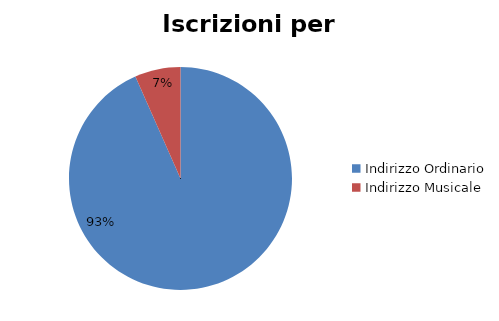
| Category | #REF! |
|---|---|
| Indirizzo Ordinario | 37202 |
| Indirizzo Musicale | 2642 |